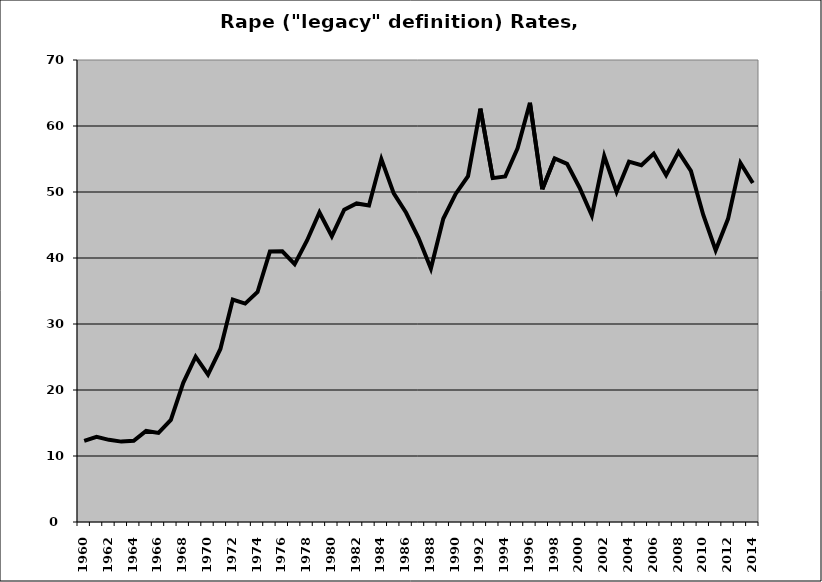
| Category | Rape |
|---|---|
| 1960.0 | 12.303 |
| 1961.0 | 12.92 |
| 1962.0 | 12.451 |
| 1963.0 | 12.181 |
| 1964.0 | 12.302 |
| 1965.0 | 13.8 |
| 1966.0 | 13.503 |
| 1967.0 | 15.454 |
| 1968.0 | 21.084 |
| 1969.0 | 25.05 |
| 1970.0 | 22.343 |
| 1971.0 | 26.214 |
| 1972.0 | 33.709 |
| 1973.0 | 33.092 |
| 1974.0 | 34.848 |
| 1975.0 | 40.976 |
| 1976.0 | 41.01 |
| 1977.0 | 39.076 |
| 1978.0 | 42.657 |
| 1979.0 | 46.898 |
| 1980.0 | 43.305 |
| 1981.0 | 47.325 |
| 1982.0 | 48.271 |
| 1983.0 | 47.963 |
| 1984.0 | 54.986 |
| 1985.0 | 49.793 |
| 1986.0 | 46.856 |
| 1987.0 | 43.067 |
| 1988.0 | 38.411 |
| 1989.0 | 45.942 |
| 1990.0 | 49.701 |
| 1991.0 | 52.39 |
| 1992.0 | 62.619 |
| 1993.0 | 52.104 |
| 1994.0 | 52.358 |
| 1995.0 | 56.617 |
| 1996.0 | 63.514 |
| 1997.0 | 50.405 |
| 1998.0 | 55.095 |
| 1999.0 | 54.258 |
| 2000.0 | 50.686 |
| 2001.0 | 46.424 |
| 2002.0 | 55.452 |
| 2003.0 | 50.038 |
| 2004.0 | 54.598 |
| 2005.0 | 54.05 |
| 2006.0 | 55.817 |
| 2007.0 | 52.54 |
| 2008.0 | 56.071 |
| 2009.0 | 53.193 |
| 2010.0 | 46.523 |
| 2011.0 | 41.18 |
| 2012.0 | 45.931 |
| 2013.0 | 54.387 |
| 2014.0 | 51.353 |